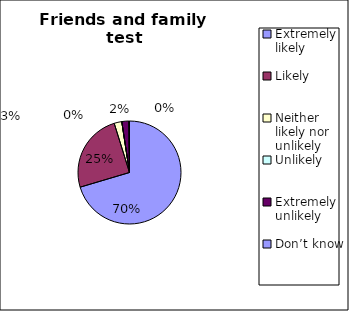
| Category | Series 0 |
|---|---|
| Extremely likely  | 264 |
| Likely  | 93 |
| Neither likely nor unlikely | 9 |
| Unlikely  | 0 |
| Extremely unlikely  | 8 |
| Don’t know  | 1 |